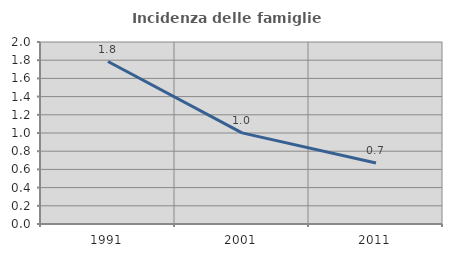
| Category | Incidenza delle famiglie numerose |
|---|---|
| 1991.0 | 1.786 |
| 2001.0 | 1.002 |
| 2011.0 | 0.671 |